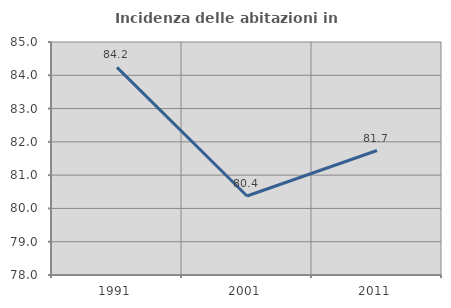
| Category | Incidenza delle abitazioni in proprietà  |
|---|---|
| 1991.0 | 84.236 |
| 2001.0 | 80.374 |
| 2011.0 | 81.739 |